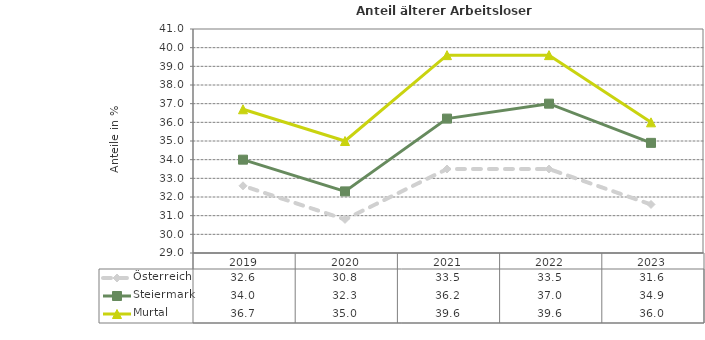
| Category | Österreich | Steiermark | Murtal |
|---|---|---|---|
| 2023.0 | 31.6 | 34.9 | 36 |
| 2022.0 | 33.5 | 37 | 39.6 |
| 2021.0 | 33.5 | 36.2 | 39.6 |
| 2020.0 | 30.8 | 32.3 | 35 |
| 2019.0 | 32.6 | 34 | 36.7 |